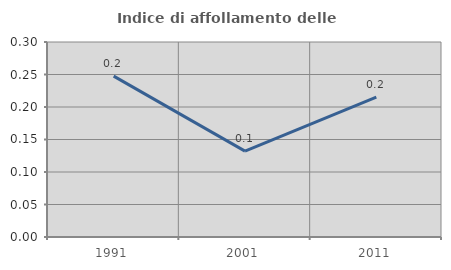
| Category | Indice di affollamento delle abitazioni  |
|---|---|
| 1991.0 | 0.248 |
| 2001.0 | 0.132 |
| 2011.0 | 0.215 |